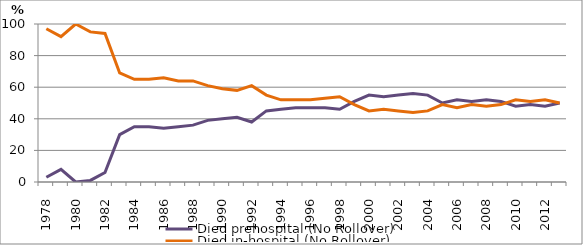
| Category | Died prehospital (No Rollover) | Died in-hospital (No Rollover) |
|---|---|---|
| 1978.0 | 3 | 97 |
| 1979.0 | 8 | 92 |
| 1980.0 | 0 | 100 |
| 1981.0 | 1 | 95 |
| 1982.0 | 6 | 94 |
| 1983.0 | 30 | 69 |
| 1984.0 | 35 | 65 |
| 1985.0 | 35 | 65 |
| 1986.0 | 34 | 66 |
| 1987.0 | 35 | 64 |
| 1988.0 | 36 | 64 |
| 1989.0 | 39 | 61 |
| 1990.0 | 40 | 59 |
| 1991.0 | 41 | 58 |
| 1992.0 | 38 | 61 |
| 1993.0 | 45 | 55 |
| 1994.0 | 46 | 52 |
| 1995.0 | 47 | 52 |
| 1996.0 | 47 | 52 |
| 1997.0 | 47 | 53 |
| 1998.0 | 46 | 54 |
| 1999.0 | 51 | 49 |
| 2000.0 | 55 | 45 |
| 2001.0 | 54 | 46 |
| 2002.0 | 55 | 45 |
| 2003.0 | 56 | 44 |
| 2004.0 | 55 | 45 |
| 2005.0 | 50 | 49 |
| 2006.0 | 52 | 47 |
| 2007.0 | 51 | 49 |
| 2008.0 | 52 | 48 |
| 2009.0 | 51 | 49 |
| 2010.0 | 48 | 52 |
| 2011.0 | 49 | 51 |
| 2012.0 | 48 | 52 |
| 2013.0 | 50 | 50 |